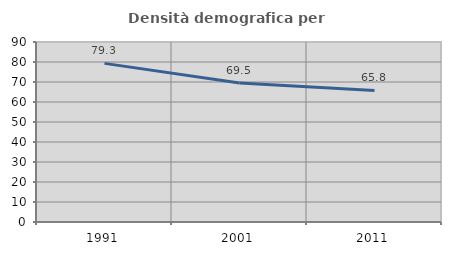
| Category | Densità demografica |
|---|---|
| 1991.0 | 79.309 |
| 2001.0 | 69.474 |
| 2011.0 | 65.778 |